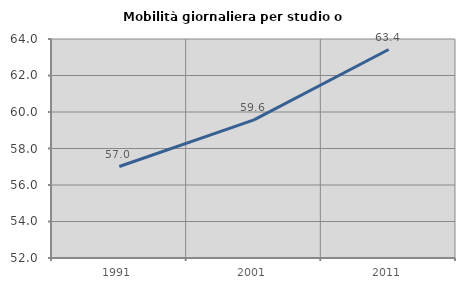
| Category | Mobilità giornaliera per studio o lavoro |
|---|---|
| 1991.0 | 57.012 |
| 2001.0 | 59.564 |
| 2011.0 | 63.423 |